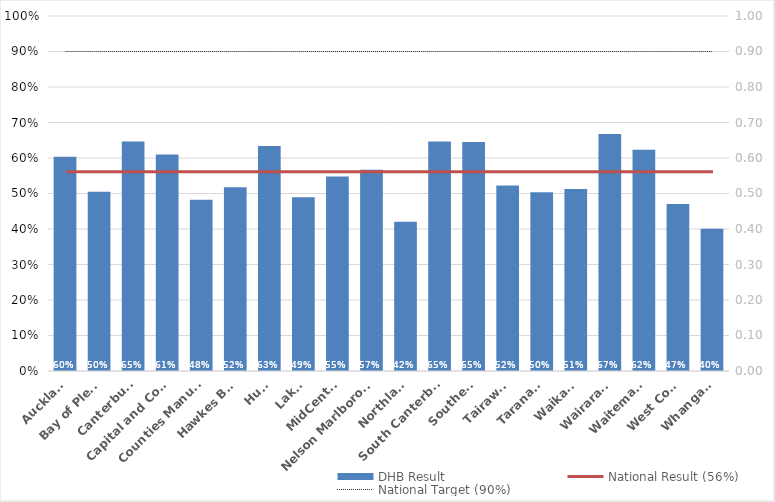
| Category | DHB Result |
|---|---|
| Auckland | 0.603 |
| Bay of Plenty | 0.505 |
| Canterbury | 0.647 |
| Capital and Coast | 0.61 |
| Counties Manukau | 0.482 |
| Hawkes Bay | 0.518 |
| Hutt | 0.634 |
| Lakes | 0.489 |
| MidCentral | 0.548 |
| Nelson Marlborough | 0.567 |
| Northland | 0.42 |
| South Canterbury | 0.646 |
| Southern | 0.645 |
| Tairawhiti | 0.523 |
| Taranaki | 0.504 |
| Waikato | 0.513 |
| Wairarapa | 0.668 |
| Waitemata | 0.623 |
| West Coast | 0.471 |
| Whanganui | 0.4 |